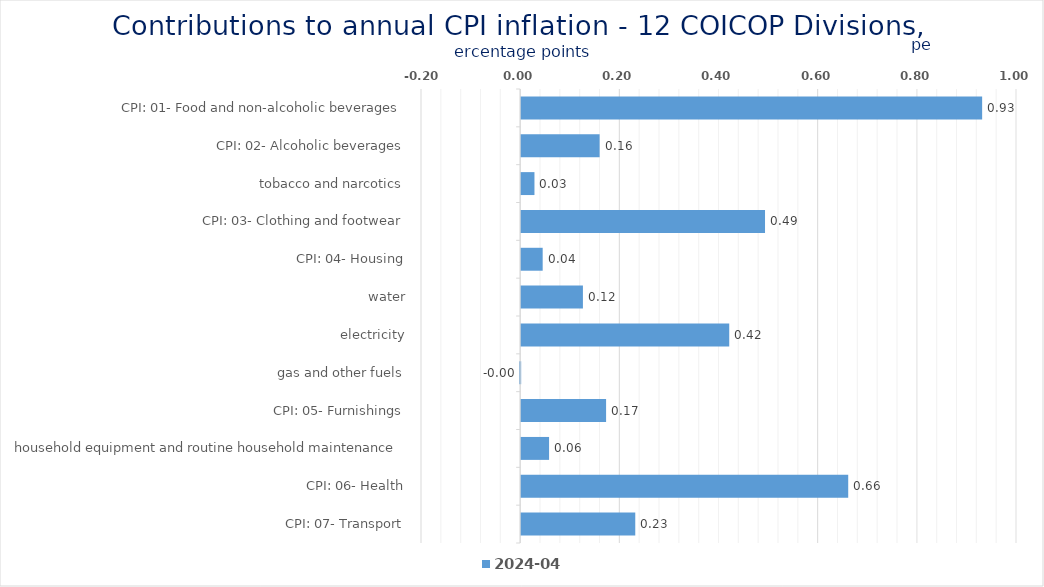
| Category | 2024-04 |
|---|---|
| CPI: 01- Food and non-alcoholic beverages | 0.93 |
| CPI: 02- Alcoholic beverages, tobacco and narcotics | 0.158 |
| CPI: 03- Clothing and footwear | 0.027 |
| CPI: 04- Housing, water, electricity, gas and other fuels | 0.492 |
| CPI: 05- Furnishings, household equipment and routine household maintenance | 0.043 |
| CPI: 06- Health | 0.125 |
| CPI: 07- Transport | 0.42 |
| CPI: 08- Communication | -0.002 |
| CPI: 09- Recreation and culture | 0.171 |
| CPI: 10- Education | 0.056 |
| CPI: 11- Restaurants and hotels | 0.66 |
| CPI: 12- Miscellaneous goods and services | 0.23 |